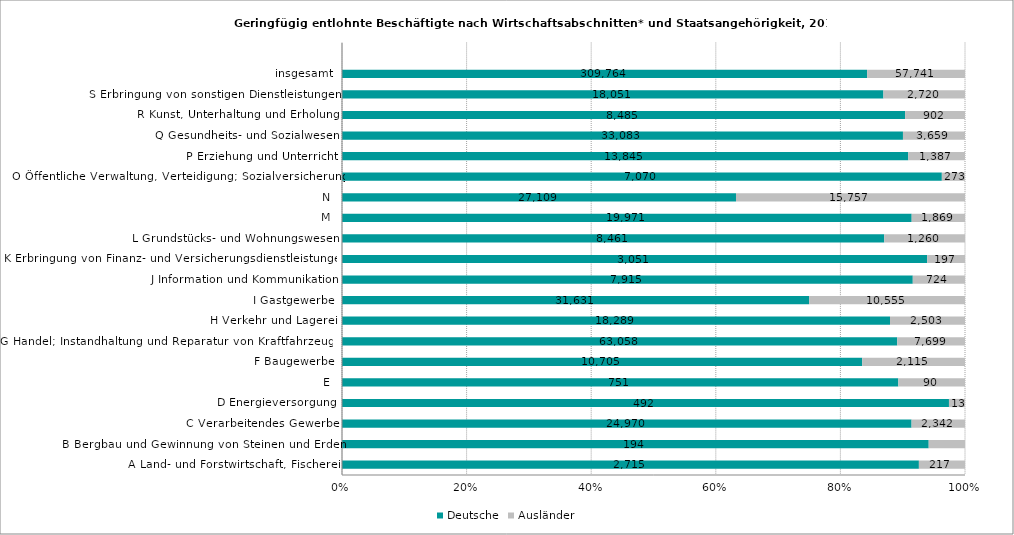
| Category | Deutsche | Ausländer |
|---|---|---|
| A Land- und Forstwirtschaft, Fischerei | 2715 | 217 |
| B Bergbau und Gewinnung von Steinen und Erden | 194 | 12 |
| C Verarbeitendes Gewerbe | 24970 | 2342 |
| D Energieversorgung | 492 | 13 |
| E | 751 | 90 |
| F Baugewerbe | 10705 | 2115 |
| G Handel; Instandhaltung und Reparatur von Kraftfahrzeugen | 63058 | 7699 |
| H Verkehr und Lagerei | 18289 | 2503 |
| I Gastgewerbe | 31631 | 10555 |
| J Information und Kommunikation | 7915 | 724 |
| K Erbringung von Finanz- und Versicherungsdienstleistungen | 3051 | 197 |
| L Grundstücks- und Wohnungswesen | 8461 | 1260 |
| M | 19971 | 1869 |
| N | 27109 | 15757 |
| O Öffentliche Verwaltung, Verteidigung; Sozialversicherung | 7070 | 273 |
| P Erziehung und Unterricht | 13845 | 1387 |
| Q Gesundheits- und Sozialwesen | 33083 | 3659 |
| R Kunst, Unterhaltung und Erholung | 8485 | 902 |
| S Erbringung von sonstigen Dienstleistungen | 18051 | 2720 |
| insgesamt | 309764 | 57741 |